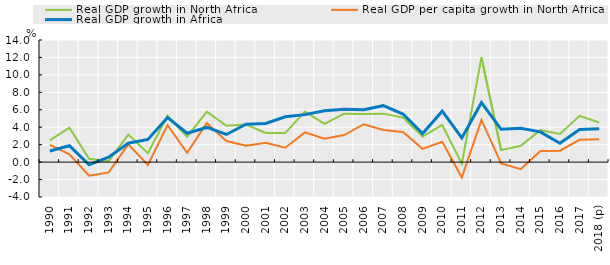
| Category | Real GDP growth in North Africa | Real GDP per capita growth in North Africa | Real GDP growth in Africa |
|---|---|---|---|
| 1990 | 2.487 | 1.979 | 1.279 |
| 1991 | 3.953 | 0.9 | 1.883 |
| 1992 | 0.381 | -1.558 | -0.307 |
| 1993 | 0.11 | -1.182 | 0.567 |
| 1994 | 3.16 | 2.032 | 2.16 |
| 1995 | 1.018 | -0.323 | 2.6 |
| 1996 | 5.316 | 4.244 | 5.112 |
| 1997 | 2.911 | 1.064 | 3.311 |
| 1998 | 5.78 | 4.468 | 3.974 |
| 1999 | 4.165 | 2.419 | 3.17 |
| 2000 | 4.298 | 1.884 | 4.347 |
| 2001 | 3.349 | 2.219 | 4.439 |
| 2002 | 3.324 | 1.645 | 5.19 |
| 2003 | 5.791 | 3.411 | 5.443 |
| 2004 | 4.392 | 2.679 | 5.886 |
| 2005 | 5.554 | 3.106 | 6.047 |
| 2006 | 5.528 | 4.346 | 6.005 |
| 2007 | 5.558 | 3.682 | 6.472 |
| 2008 | 5.1 | 3.457 | 5.512 |
| 2009 | 2.933 | 1.519 | 3.27 |
| 2010 | 4.256 | 2.327 | 5.844 |
| 2011 | -0.183 | -1.757 | 2.775 |
| 2012 | 12.002 | 4.84 | 6.828 |
| 2013 | 1.382 | -0.143 | 3.765 |
| 2014 | 1.862 | -0.809 | 3.875 |
| 2015 | 3.66 | 1.274 | 3.464 |
| 2016 | 3.219 | 1.315 | 2.159 |
| 2017 | 5.307 | 2.555 | 3.74 |
| 2018 (p) | 4.543 | 2.607 | 3.829 |